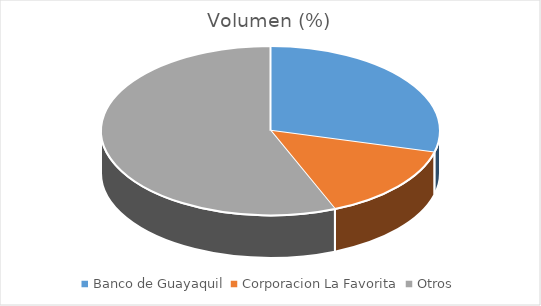
| Category | Volumen |
|---|---|
| Banco de Guayaquil | 246695.48 |
| Corporacion La Favorita | 124060.25 |
| Otros | 475757.1 |